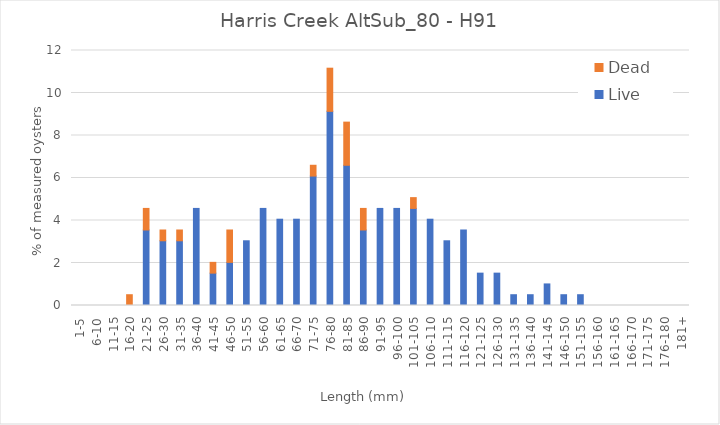
| Category | Live | Dead |
|---|---|---|
| 1-5 | 0 | 0 |
| 6-10 | 0 | 0 |
| 11-15 | 0 | 0 |
| 16-20 | 0 | 0.508 |
| 21-25 | 3.553 | 1.015 |
| 26-30 | 3.046 | 0.508 |
| 31-35 | 3.046 | 0.508 |
| 36-40 | 4.569 | 0 |
| 41-45 | 1.523 | 0.508 |
| 46-50 | 2.03 | 1.523 |
| 51-55 | 3.046 | 0 |
| 56-60 | 4.569 | 0 |
| 61-65 | 4.061 | 0 |
| 66-70 | 4.061 | 0 |
| 71-75 | 6.091 | 0.508 |
| 76-80 | 9.137 | 2.03 |
| 81-85 | 6.599 | 2.03 |
| 86-90 | 3.553 | 1.015 |
| 91-95 | 4.569 | 0 |
| 96-100 | 4.569 | 0 |
| 101-105 | 4.569 | 0.508 |
| 106-110 | 4.061 | 0 |
| 111-115 | 3.046 | 0 |
| 116-120 | 3.553 | 0 |
| 121-125 | 1.523 | 0 |
| 126-130 | 1.523 | 0 |
| 131-135 | 0.508 | 0 |
| 136-140 | 0.508 | 0 |
| 141-145 | 1.015 | 0 |
| 146-150 | 0.508 | 0 |
| 151-155 | 0.508 | 0 |
| 156-160 | 0 | 0 |
| 161-165 | 0 | 0 |
| 166-170 | 0 | 0 |
| 171-175 | 0 | 0 |
| 176-180 | 0 | 0 |
| 181+ | 0 | 0 |